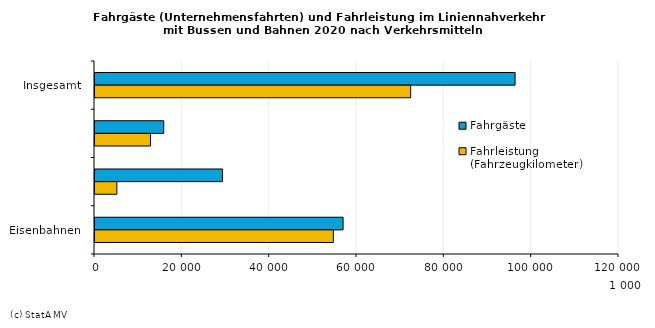
| Category | Fahrgäste | Fahrleistung (Fahrzeugkilometer) |
|---|---|---|
| Insgesamt | 96204 | 72297 |
| Eisenbahnen | 15739 | 12710 |
| Straßenbahnen | 29191 | 5004 |
| Omnibussen | 56813 | 54584 |